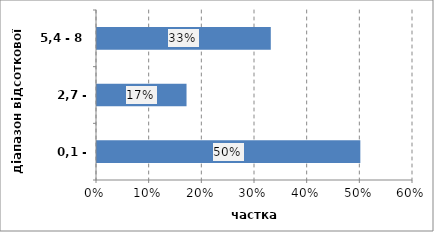
| Category | Series 0 |
|---|---|
| 0,1 - 2,7 | 0.5 |
| 2,7 - 5,4 | 0.17 |
| 5,4 - 8 | 0.33 |